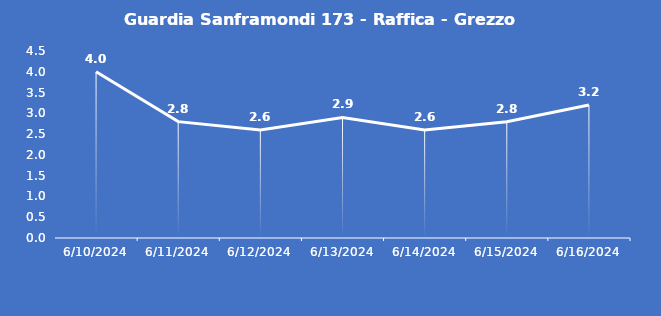
| Category | Guardia Sanframondi 173 - Raffica - Grezzo (m/s) |
|---|---|
| 6/10/24 | 4 |
| 6/11/24 | 2.8 |
| 6/12/24 | 2.6 |
| 6/13/24 | 2.9 |
| 6/14/24 | 2.6 |
| 6/15/24 | 2.8 |
| 6/16/24 | 3.2 |